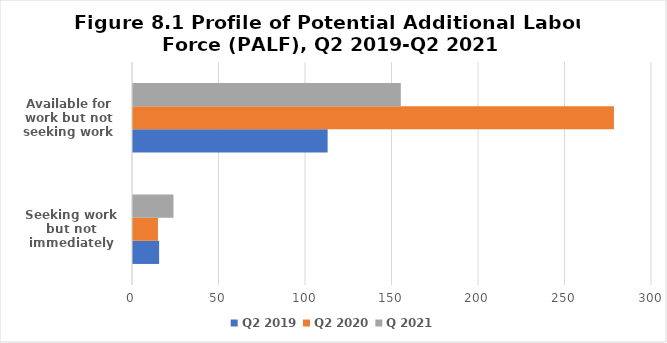
| Category | Q2 2019 | Q2 2020 | Q 2021 |
|---|---|---|---|
| Seeking work but not immediately available  | 15.1 | 14.4 | 23.4 |
| Available for work but not seeking work | 112.5 | 278 | 154.8 |